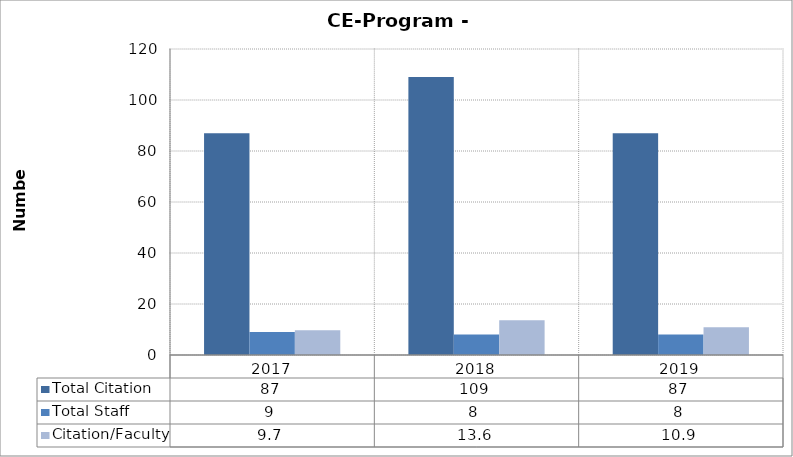
| Category | Total Citation  | Total Staff | Citation/Faculty |
|---|---|---|---|
| 2017.0 | 87 | 9 | 9.667 |
| 2018.0 | 109 | 8 | 13.625 |
| 2019.0 | 87 | 8 | 10.875 |